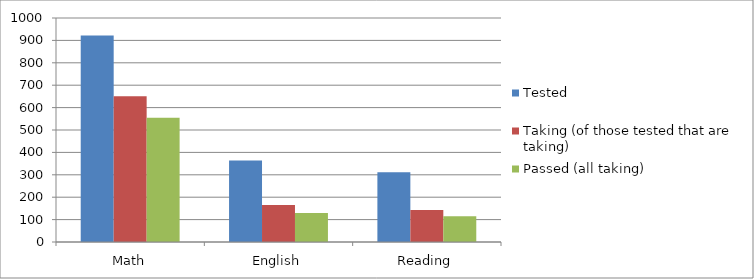
| Category | Tested | Taking (of those tested that are taking) | Passed (all taking) |
|---|---|---|---|
| Math | 922 | 651 | 555 |
| English | 364 | 165 | 129 |
| Reading | 311 | 143 | 115 |